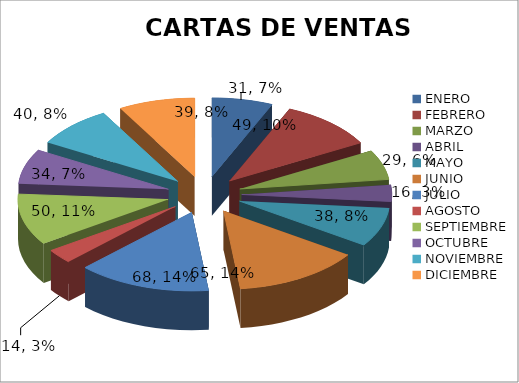
| Category | CARTAS DE VENTAS EMITIDAS |
|---|---|
| ENERO | 31 |
| FEBRERO | 49 |
| MARZO | 29 |
| ABRIL | 16 |
| MAYO | 38 |
| JUNIO | 65 |
| JULIO | 68 |
| AGOSTO  | 14 |
| SEPTIEMBRE | 50 |
| OCTUBRE | 34 |
| NOVIEMBRE | 40 |
| DICIEMBRE | 39 |